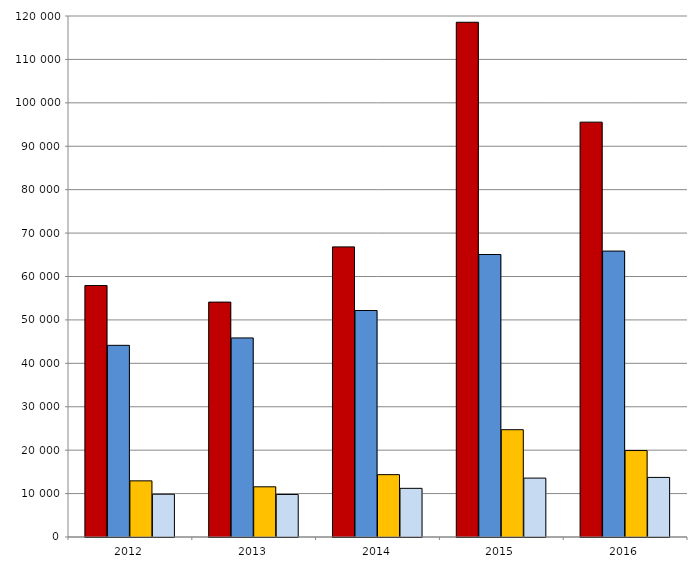
| Category | Steuerpflichtiger Erwerb absolut 1 000 EUR | Steuerpflichtiger Erwerb durchschnittlich EUR | Festgesetzte Steuer absolut 1 000 EUR | Festgesetzte Steuer durchschnittlich EUR |
|---|---|---|---|---|
| 2012.0 | 57921 | 44147 | 12931 | 9856 |
| 2013.0 | 54103 | 45850 | 11561 | 9797 |
| 2014.0 | 66823 | 52165 | 14360 | 11210 |
| 2015.0 | 118558 | 65070.252 | 24716 | 13565.313 |
| 2016.0 | 95554 | 65853.894 | 19913 | 13723.639 |